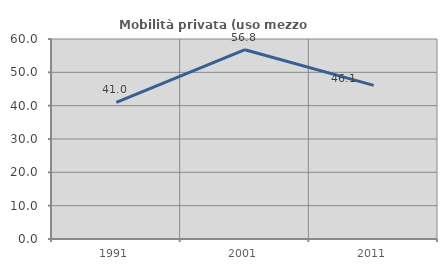
| Category | Mobilità privata (uso mezzo privato) |
|---|---|
| 1991.0 | 40.972 |
| 2001.0 | 56.78 |
| 2011.0 | 46.094 |